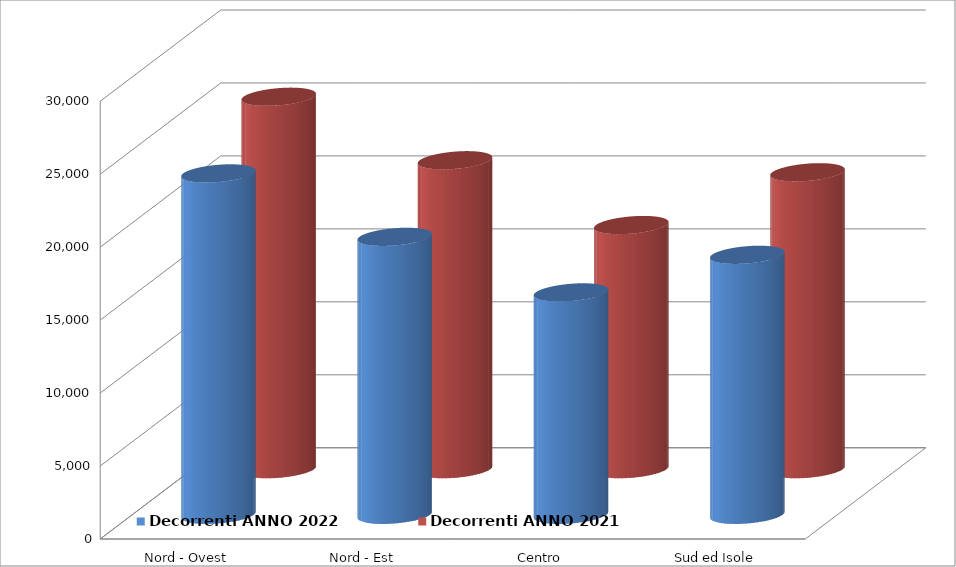
| Category | Decorrenti ANNO 2022 | Decorrenti ANNO 2021 |
|---|---|---|
| Nord - Ovest | 23397 | 25524 |
| Nord - Est | 19050 | 21173 |
| Centro | 15243 | 16733 |
| Sud ed Isole | 17818 | 20349 |